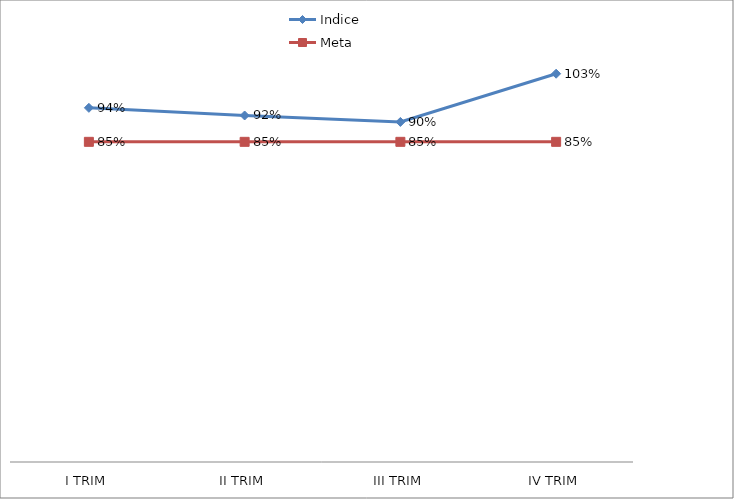
| Category | Indice | Meta |
|---|---|---|
| I TRIM | 0.94 | 0.85 |
| II TRIM | 0.92 | 0.85 |
| III TRIM | 0.903 | 0.85 |
| IV TRIM | 1.031 | 0.85 |